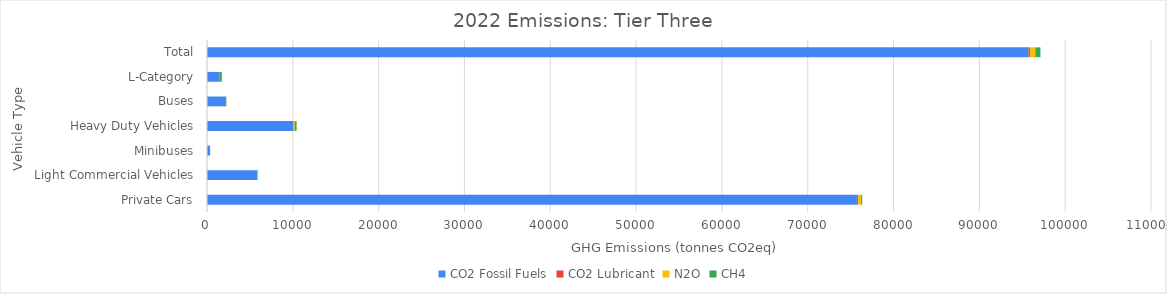
| Category | CO2 Fossil Fuels | CO2 Lubricant | N2O | CH4 |
|---|---|---|---|---|
| Private Cars | 75724.736 | 156.494 | 345.027 | 125.574 |
| Light Commercial Vehicles | 5877.166 | 10.39 | 63.664 | 8.964 |
| Minibuses | 363.236 | 0.627 | 4.162 | 0.052 |
| Heavy Duty Vehicles | 10086.149 | 10.286 | 138.168 | 207.72 |
| Buses | 2206.923 | 3.296 | 24.354 | 30.048 |
| L-Category | 1479.487 | 12.07 | 8.812 | 228.665 |
| Total | 95737.698 | 193.162 | 584.189 | 601.023 |